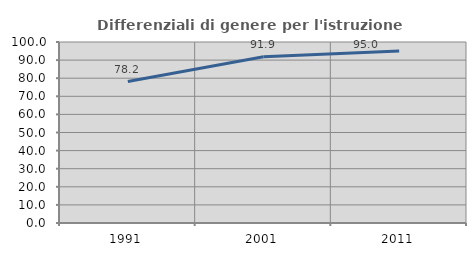
| Category | Differenziali di genere per l'istruzione superiore |
|---|---|
| 1991.0 | 78.158 |
| 2001.0 | 91.873 |
| 2011.0 | 94.976 |